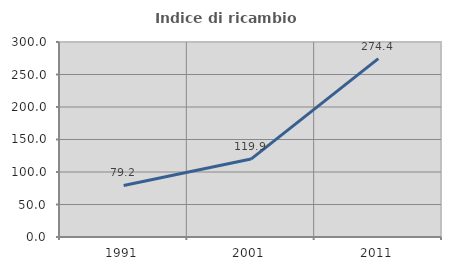
| Category | Indice di ricambio occupazionale  |
|---|---|
| 1991.0 | 79.245 |
| 2001.0 | 119.856 |
| 2011.0 | 274.351 |